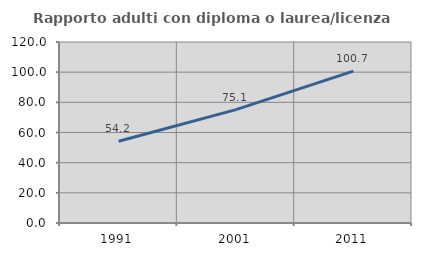
| Category | Rapporto adulti con diploma o laurea/licenza media  |
|---|---|
| 1991.0 | 54.217 |
| 2001.0 | 75.139 |
| 2011.0 | 100.738 |